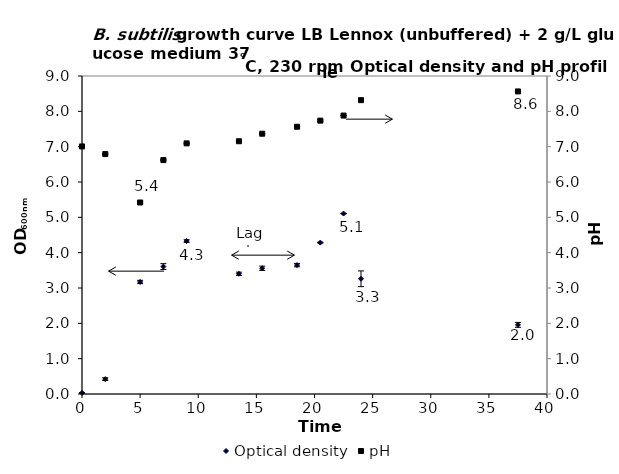
| Category | Optical density |
|---|---|
| 0.0 | 0.031 |
| 2.0 | 0.422 |
| 5.0 | 3.171 |
| 7.0 | 3.605 |
| 9.0 | 4.328 |
| 13.5 | 3.402 |
| 15.5 | 3.558 |
| 18.5 | 3.648 |
| 20.5 | 4.285 |
| 22.5 | 5.106 |
| 24.0 | 3.261 |
| 37.5 | 1.957 |